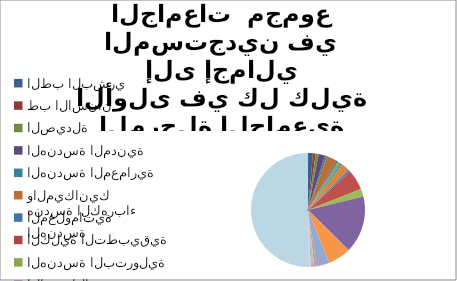
| Category | مؤشر يبين توزع المستجدين  بين الذكور والاناث ويبين نسبة توزع مستجدين المرحلة الجامعية الأولى في كل كلية إلى إجمالي المستجدين في الجامعات  مجموع |
|---|---|
| الطب البشري | 3560 |
| طب الاسنان  | 2006 |
| الصيدلة | 2100 |
| الهندسة المدنية | 4611 |
| الهندسة المعمارية | 1635 |
| هندسة الكهرباء والميكانيك     | 7332 |
| الهندسة المعلوماتية  | 1175 |
| الكلية التطبيقية | 348 |
| الهندسة البترولية | 1774 |
| هندسة تكنولوجيا الاتصالات  | 218 |
| الهندسة التقنية | 1660 |
| الهندسة الزراعية  | 5686 |
| الطب البيطري | 1716 |
| العلوم | 14730 |
| الاقتصاد | 5677 |
| الاداب | 41281 |
| الإعلام | 281 |
| التربية  | 16643 |
| الحقوق | 9263 |
| الشريعة | 1731 |
| العلوم السياسية | 786 |
| الفنون الجميلة | 648 |
| التمريض | 1081 |
| التربية الموسيقية | 81 |
| التربية الرياضية | 396 |
| العلوم الصحية | 313 |
| العلوم الادارية | 530 |
| السياحة | 597 |
| المجموع | 127859 |